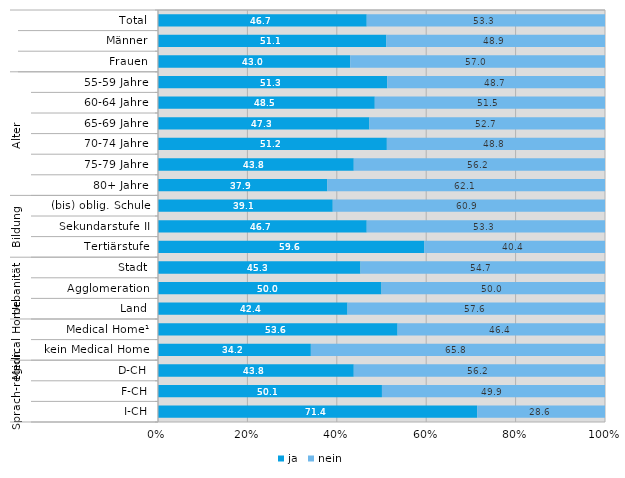
| Category | ja | nein |
|---|---|---|
| 0 | 46.7 | 53.3 |
| 1 | 51.1 | 48.9 |
| 2 | 43 | 57 |
| 3 | 51.3 | 48.7 |
| 4 | 48.5 | 51.5 |
| 5 | 47.3 | 52.7 |
| 6 | 51.2 | 48.8 |
| 7 | 43.8 | 56.2 |
| 8 | 37.9 | 62.1 |
| 9 | 39.1 | 60.9 |
| 10 | 46.7 | 53.3 |
| 11 | 59.6 | 40.4 |
| 12 | 45.3 | 54.7 |
| 13 | 50 | 50 |
| 14 | 42.4 | 57.6 |
| 15 | 53.6 | 46.4 |
| 16 | 34.2 | 65.8 |
| 17 | 43.8 | 56.2 |
| 18 | 50.1 | 49.9 |
| 19 | 71.4 | 28.6 |